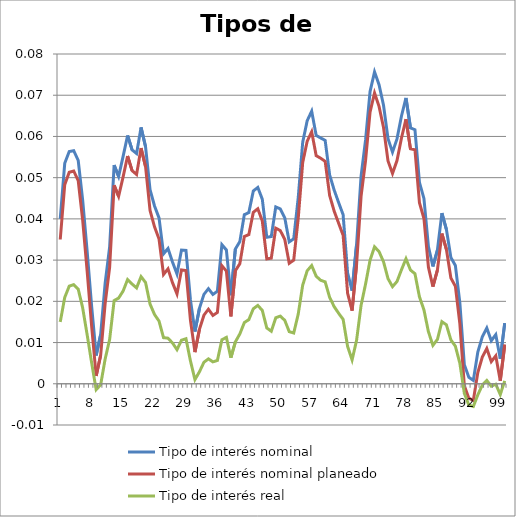
| Category | Tipo de interés nominal | Tipo de interés nominal planeado | Tipo de interés real |
|---|---|---|---|
| 0 | 0.04 | 0.035 | 0.015 |
| 1 | 0.053 | 0.048 | 0.021 |
| 2 | 0.056 | 0.051 | 0.024 |
| 3 | 0.057 | 0.052 | 0.024 |
| 4 | 0.054 | 0.049 | 0.023 |
| 5 | 0.045 | 0.04 | 0.018 |
| 6 | 0.032 | 0.027 | 0.012 |
| 7 | 0.019 | 0.014 | 0.005 |
| 8 | 0.007 | 0.002 | -0.001 |
| 9 | 0.012 | 0.007 | 0 |
| 10 | 0.024 | 0.019 | 0.006 |
| 11 | 0.033 | 0.028 | 0.011 |
| 12 | 0.053 | 0.048 | 0.02 |
| 13 | 0.05 | 0.045 | 0.021 |
| 14 | 0.055 | 0.05 | 0.022 |
| 15 | 0.06 | 0.055 | 0.025 |
| 16 | 0.057 | 0.052 | 0.024 |
| 17 | 0.056 | 0.051 | 0.023 |
| 18 | 0.062 | 0.057 | 0.026 |
| 19 | 0.058 | 0.053 | 0.025 |
| 20 | 0.047 | 0.042 | 0.019 |
| 21 | 0.043 | 0.038 | 0.017 |
| 22 | 0.04 | 0.035 | 0.015 |
| 23 | 0.032 | 0.027 | 0.011 |
| 24 | 0.033 | 0.028 | 0.011 |
| 25 | 0.03 | 0.025 | 0.01 |
| 26 | 0.027 | 0.022 | 0.008 |
| 27 | 0.032 | 0.028 | 0.011 |
| 28 | 0.032 | 0.027 | 0.011 |
| 29 | 0.02 | 0.015 | 0.006 |
| 30 | 0.013 | 0.008 | 0.001 |
| 31 | 0.018 | 0.013 | 0.003 |
| 32 | 0.022 | 0.017 | 0.005 |
| 33 | 0.023 | 0.018 | 0.006 |
| 34 | 0.022 | 0.017 | 0.005 |
| 35 | 0.022 | 0.017 | 0.006 |
| 36 | 0.034 | 0.029 | 0.011 |
| 37 | 0.032 | 0.027 | 0.011 |
| 38 | 0.021 | 0.016 | 0.006 |
| 39 | 0.033 | 0.027 | 0.01 |
| 40 | 0.035 | 0.029 | 0.012 |
| 41 | 0.041 | 0.036 | 0.015 |
| 42 | 0.042 | 0.036 | 0.016 |
| 43 | 0.047 | 0.042 | 0.018 |
| 44 | 0.048 | 0.042 | 0.019 |
| 45 | 0.045 | 0.039 | 0.018 |
| 46 | 0.036 | 0.03 | 0.014 |
| 47 | 0.036 | 0.03 | 0.013 |
| 48 | 0.043 | 0.038 | 0.016 |
| 49 | 0.042 | 0.037 | 0.016 |
| 50 | 0.04 | 0.035 | 0.015 |
| 51 | 0.034 | 0.029 | 0.013 |
| 52 | 0.035 | 0.03 | 0.012 |
| 53 | 0.045 | 0.04 | 0.017 |
| 54 | 0.059 | 0.054 | 0.024 |
| 55 | 0.064 | 0.059 | 0.027 |
| 56 | 0.066 | 0.061 | 0.029 |
| 57 | 0.06 | 0.055 | 0.026 |
| 58 | 0.06 | 0.055 | 0.025 |
| 59 | 0.059 | 0.054 | 0.025 |
| 60 | 0.051 | 0.046 | 0.021 |
| 61 | 0.047 | 0.042 | 0.019 |
| 62 | 0.044 | 0.039 | 0.017 |
| 63 | 0.041 | 0.036 | 0.016 |
| 64 | 0.027 | 0.022 | 0.009 |
| 65 | 0.023 | 0.018 | 0.006 |
| 66 | 0.034 | 0.029 | 0.011 |
| 67 | 0.05 | 0.045 | 0.019 |
| 68 | 0.059 | 0.054 | 0.024 |
| 69 | 0.071 | 0.066 | 0.03 |
| 70 | 0.076 | 0.071 | 0.033 |
| 71 | 0.073 | 0.067 | 0.032 |
| 72 | 0.068 | 0.062 | 0.03 |
| 73 | 0.059 | 0.054 | 0.026 |
| 74 | 0.056 | 0.051 | 0.024 |
| 75 | 0.059 | 0.054 | 0.025 |
| 76 | 0.065 | 0.06 | 0.028 |
| 77 | 0.069 | 0.064 | 0.03 |
| 78 | 0.062 | 0.057 | 0.028 |
| 79 | 0.062 | 0.057 | 0.027 |
| 80 | 0.049 | 0.044 | 0.021 |
| 81 | 0.045 | 0.04 | 0.018 |
| 82 | 0.033 | 0.028 | 0.013 |
| 83 | 0.028 | 0.024 | 0.009 |
| 84 | 0.032 | 0.028 | 0.011 |
| 85 | 0.041 | 0.036 | 0.015 |
| 86 | 0.037 | 0.033 | 0.014 |
| 87 | 0.031 | 0.026 | 0.011 |
| 88 | 0.029 | 0.024 | 0.009 |
| 89 | 0.02 | 0.015 | 0.005 |
| 90 | 0.005 | 0 | -0.002 |
| 91 | 0.002 | -0.003 | -0.005 |
| 92 | 0.001 | -0.004 | -0.006 |
| 93 | 0.008 | 0.003 | -0.003 |
| 94 | 0.011 | 0.006 | 0 |
| 95 | 0.014 | 0.009 | 0.001 |
| 96 | 0.01 | 0.005 | -0.001 |
| 97 | 0.012 | 0.007 | 0 |
| 98 | 0.006 | 0.001 | -0.003 |
| 99 | 0.015 | 0.009 | 0.001 |